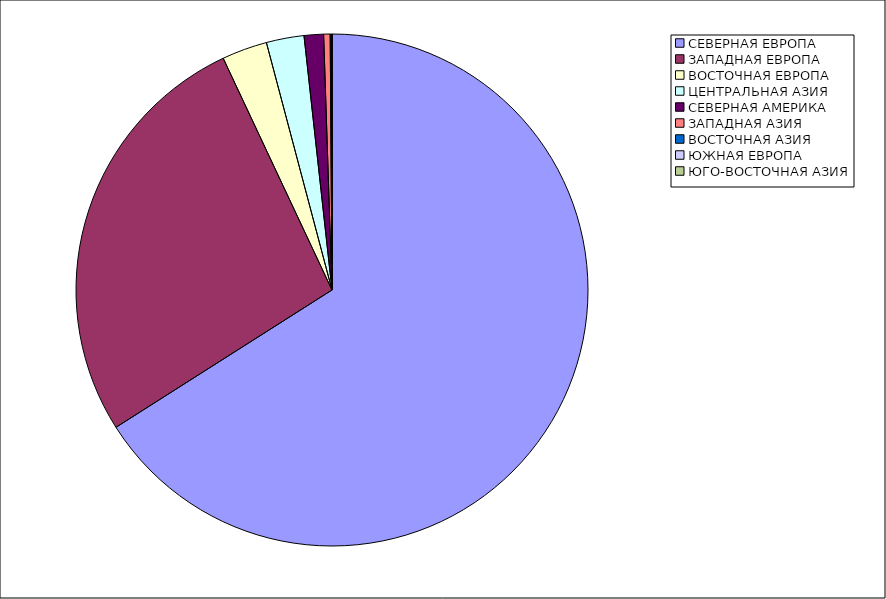
| Category | Оборот |
|---|---|
| СЕВЕРНАЯ ЕВРОПА | 65.988 |
| ЗАПАДНАЯ ЕВРОПА | 27.025 |
| ВОСТОЧНАЯ ЕВРОПА | 2.861 |
| ЦЕНТРАЛЬНАЯ АЗИЯ | 2.38 |
| СЕВЕРНАЯ АМЕРИКА | 1.223 |
| ЗАПАДНАЯ АЗИЯ | 0.41 |
| ВОСТОЧНАЯ АЗИЯ | 0.097 |
| ЮЖНАЯ ЕВРОПА | 0.016 |
| ЮГО-ВОСТОЧНАЯ АЗИЯ | 0 |